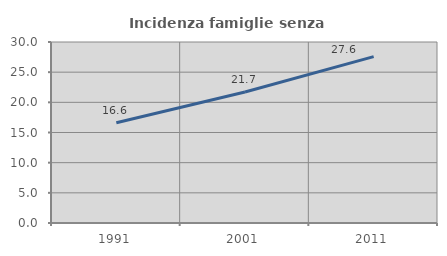
| Category | Incidenza famiglie senza nuclei |
|---|---|
| 1991.0 | 16.628 |
| 2001.0 | 21.724 |
| 2011.0 | 27.581 |